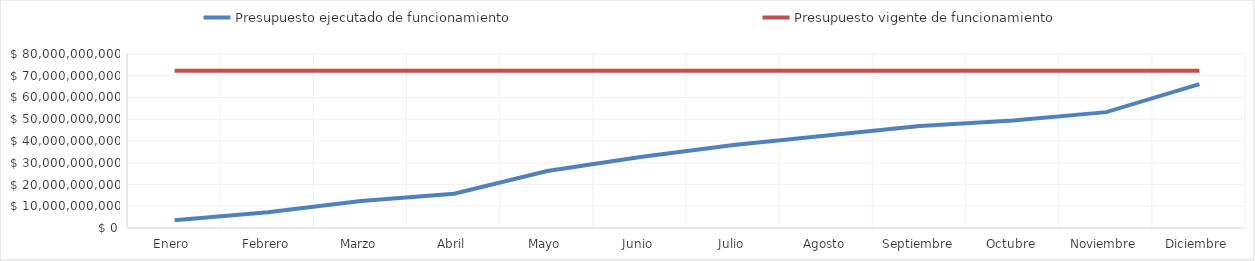
| Category | Presupuesto ejecutado de funcionamiento | Presupuesto vigente de funcionamiento |
|---|---|---|
| Enero  | 3604828283 | 72311486000 |
| Febrero | 7198365243 | 72311486000 |
| Marzo | 12462015939 | 72311486000 |
| Abril | 15781894914 | 72311486000 |
| Mayo | 26182460102 | 72311486000 |
| Junio | 32681461686 | 72311486000 |
| Julio | 38160089027 | 72311486000 |
| Agosto | 42477629033 | 72311486000 |
| Septiembre | 46933802765 | 72311486000 |
| Octubre | 49477317873 | 72311486000 |
| Noviembre | 53264919156 | 72311486000 |
| Diciembre | 66166038784 | 72311486000 |